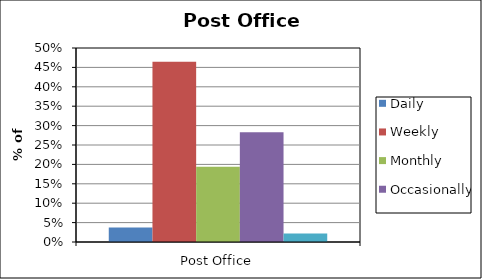
| Category | Daily | Weekly | Monthly | Occasionally | Never |
|---|---|---|---|---|---|
| Post Office | 0.038 | 0.464 | 0.194 | 0.283 | 0.022 |